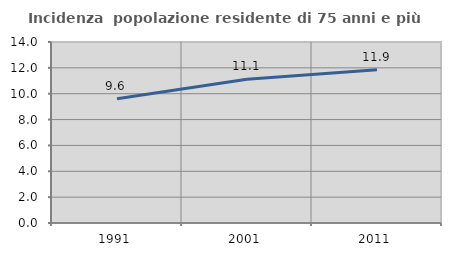
| Category | Incidenza  popolazione residente di 75 anni e più |
|---|---|
| 1991.0 | 9.611 |
| 2001.0 | 11.111 |
| 2011.0 | 11.85 |